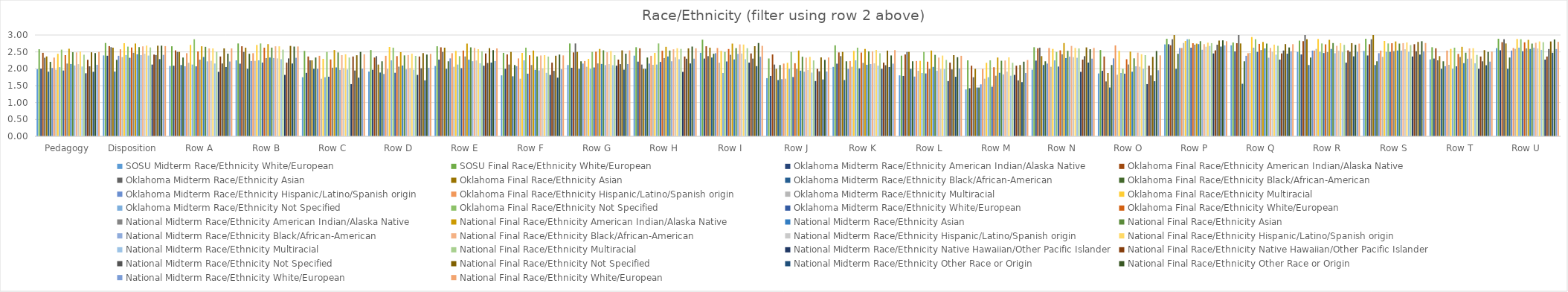
| Category | SOSU | Oklahoma | National |
|---|---|---|---|
| Pedagogy | 2.579 | 2.404 | 2.5 |
| Disposition | 2.764 | 2.628 | 2.672 |
| Row A | 2.667 | 2.513 | 2.603 |
| Row B | 2.75 | 2.625 | 2.661 |
| Row C | 2.528 | 2.276 | 2.429 |
| Row D | 2.556 | 2.375 | 2.441 |
| Row E | 2.667 | 2.54 | 2.603 |
| Row F | 2.472 | 2.401 | 2.396 |
| Row G | 2.75 | 2.507 | 2.544 |
| Row H | 2.639 | 2.533 | 2.607 |
| Row I | 2.861 | 2.586 | 2.678 |
| Row J | 2.306 | 2.164 | 2.335 |
| Row K | 2.694 | 2.48 | 2.554 |
| Row L | 2.389 | 2.21 | 2.385 |
| Row M | 2.25 | 2.046 | 2.259 |
| Row N | 2.639 | 2.546 | 2.618 |
| Row O | 2.556 | 2.283 | 2.397 |
| Row P | 2.889 | 2.757 | 2.816 |
| Row Q | 2.778 | 2.737 | 2.728 |
| Row R | 2.833 | 2.724 | 2.746 |
| Row S | 2.889 | 2.757 | 2.763 |
| Row T | 2.639 | 2.441 | 2.508 |
| Row U | 2.889 | 2.783 | 2.798 |